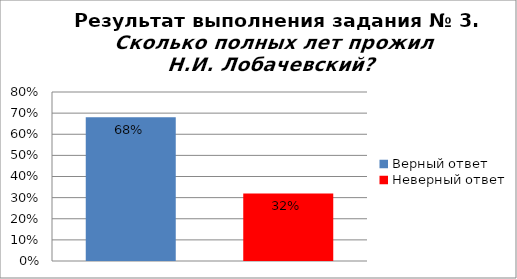
| Category | Сколько полных лет прожил Н.И. Лобачевский? |
|---|---|
| Верный ответ | 0.68 |
| Неверный ответ | 0.32 |